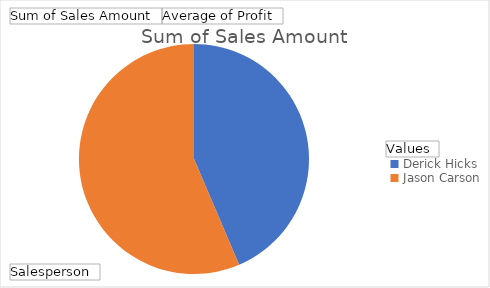
| Category | Sum of Sales Amount | Average of Profit |
|---|---|---|
| Derick Hicks | 49860 | 2357 |
| Jason Carson | 64540 | 2596.833 |